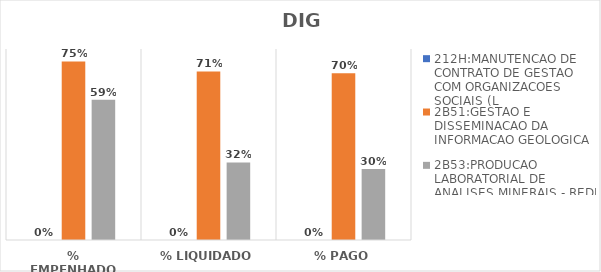
| Category | 212H:MANUTENCAO DE CONTRATO DE GESTAO COM ORGANIZACOES SOCIAIS (L | 2B51:GESTAO E DISSEMINACAO DA INFORMACAO GEOLOGICA | 2B53:PRODUCAO LABORATORIAL DE ANALISES MINERAIS - REDE LAMIN |
|---|---|---|---|
| % EMPENHADO | 0 | 0.748 | 0.587 |
| % LIQUIDADO | 0 | 0.706 | 0.325 |
| % PAGO | 0 | 0.699 | 0.297 |